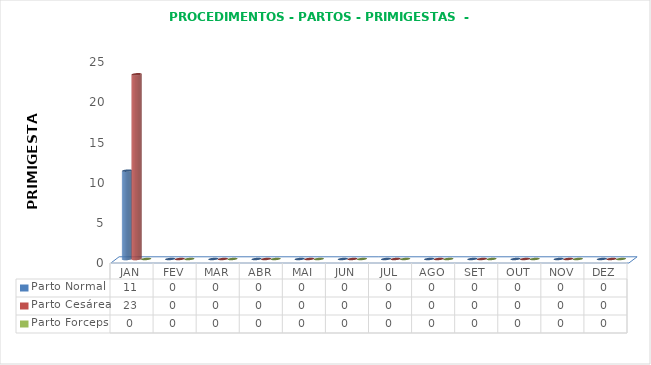
| Category | Parto Normal | Parto Cesárea | Parto Forceps |
|---|---|---|---|
| JAN | 11 | 23 | 0 |
| FEV | 0 | 0 | 0 |
| MAR | 0 | 0 | 0 |
| ABR | 0 | 0 | 0 |
| MAI | 0 | 0 | 0 |
| JUN | 0 | 0 | 0 |
| JUL | 0 | 0 | 0 |
| AGO | 0 | 0 | 0 |
| SET | 0 | 0 | 0 |
| OUT | 0 | 0 | 0 |
| NOV | 0 | 0 | 0 |
| DEZ | 0 | 0 | 0 |